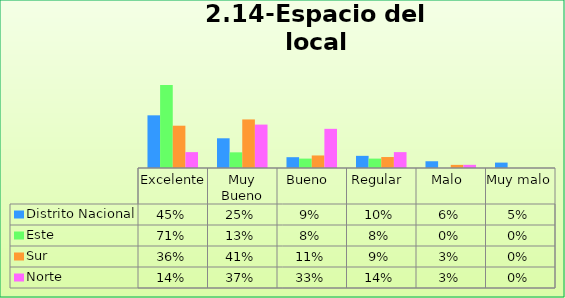
| Category | Distrito Nacional | Este | Sur  | Norte |
|---|---|---|---|---|
| Excelente | 0.448 | 0.707 | 0.36 | 0.135 |
| Muy Bueno | 0.253 | 0.133 | 0.413 | 0.369 |
| Bueno  | 0.092 | 0.08 | 0.107 | 0.333 |
| Regular  | 0.103 | 0.08 | 0.093 | 0.135 |
| Malo  | 0.057 | 0 | 0.027 | 0.027 |
| Muy malo  | 0.046 | 0 | 0 | 0 |